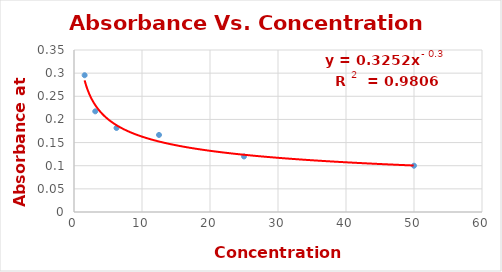
| Category | Series 0 |
|---|---|
| 50.0 | 0.1 |
| 25.0 | 0.12 |
| 12.5 | 0.166 |
| 6.25 | 0.182 |
| 3.125 | 0.218 |
| 1.5625 | 0.296 |